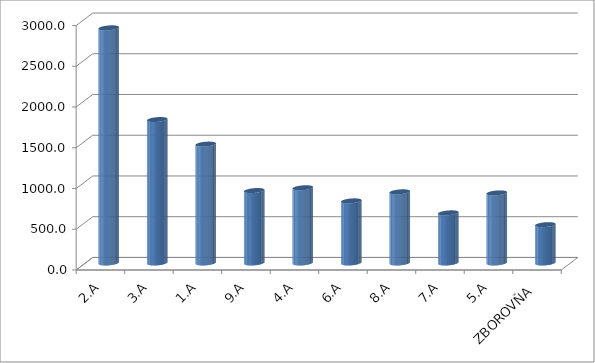
| Category | Series 0 |
|---|---|
| 2.A | 2886 |
| 3.A | 1760.5 |
| 1.A | 1459 |
| 9.A | 889 |
| 4.A | 923.5 |
| 6.A | 762.5 |
| 8.A | 873.5 |
| 7.A | 615.5 |
| 5.A | 860.5 |
| ZBOROVŇA | 470.5 |